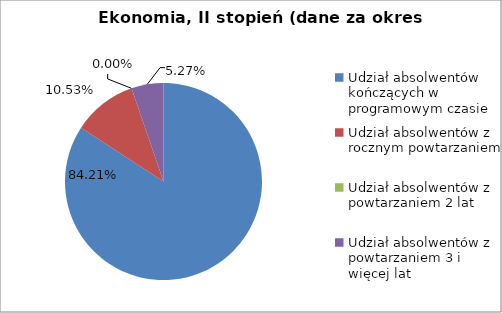
| Category | Series 0 |
|---|---|
| Udział absolwentów kończących w programowym czasie | 84.211 |
| Udział absolwentów z rocznym powtarzaniem | 10.526 |
| Udział absolwentów z powtarzaniem 2 lat | 0 |
| Udział absolwentów z powtarzaniem 3 i więcej lat | 5.263 |